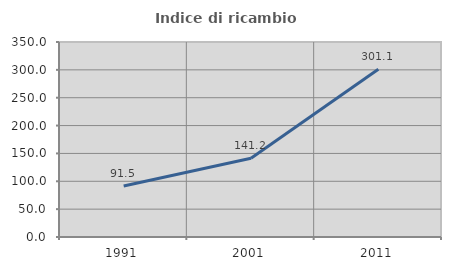
| Category | Indice di ricambio occupazionale  |
|---|---|
| 1991.0 | 91.467 |
| 2001.0 | 141.237 |
| 2011.0 | 301.099 |